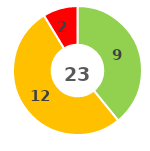
| Category | Series 0 |
|---|---|
| 0 | 0 |
| 1 | 9 |
| 2 | 12 |
| 3 | 2 |
| 4 | 0 |